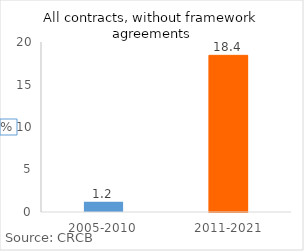
| Category | mgts_plus, without framework agreements, % |
|---|---|
| 2005-2010 | 1.193 |
| 2011-2021 | 18.429 |